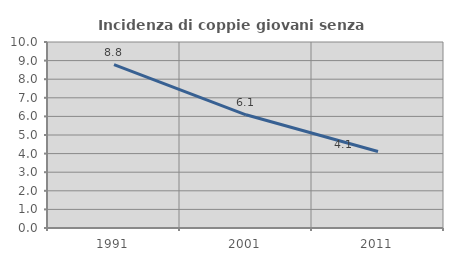
| Category | Incidenza di coppie giovani senza figli |
|---|---|
| 1991.0 | 8.779 |
| 2001.0 | 6.087 |
| 2011.0 | 4.111 |